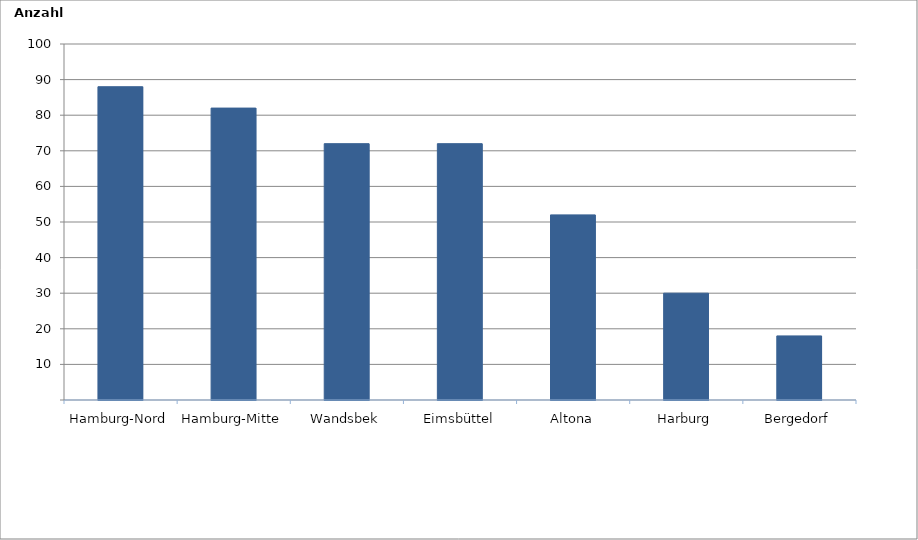
| Category | Series 0 |
|---|---|
| Hamburg-Nord | 88 |
| Hamburg-Mitte | 82 |
| Wandsbek | 72 |
| Eimsbüttel | 72 |
| Altona | 52 |
| Harburg | 30 |
| Bergedorf | 18 |